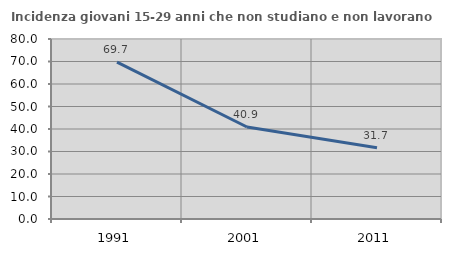
| Category | Incidenza giovani 15-29 anni che non studiano e non lavorano  |
|---|---|
| 1991.0 | 69.697 |
| 2001.0 | 40.903 |
| 2011.0 | 31.669 |